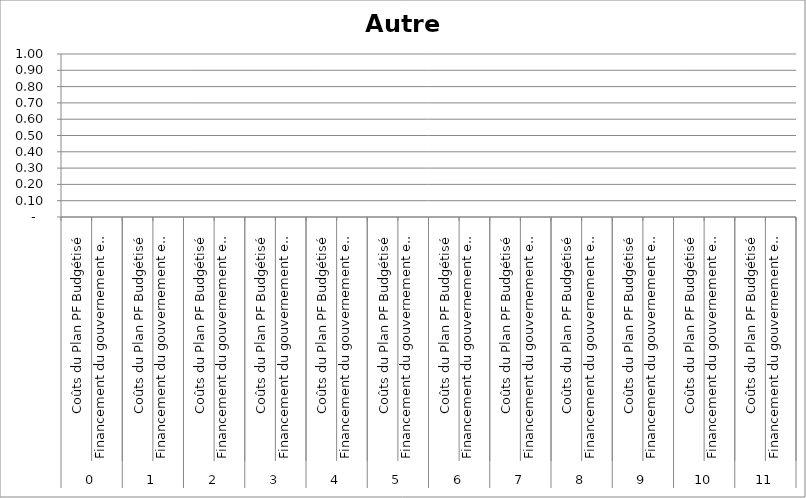
| Category | Autre 10 |
|---|---|
| 0 | 0 |
| 1 | 0 |
| 2 | 0 |
| 3 | 0 |
| 4 | 0 |
| 5 | 0 |
| 6 | 0 |
| 7 | 0 |
| 8 | 0 |
| 9 | 0 |
| 10 | 0 |
| 11 | 0 |
| 12 | 0 |
| 13 | 0 |
| 14 | 0 |
| 15 | 0 |
| 16 | 0 |
| 17 | 0 |
| 18 | 0 |
| 19 | 0 |
| 20 | 0 |
| 21 | 0 |
| 22 | 0 |
| 23 | 0 |